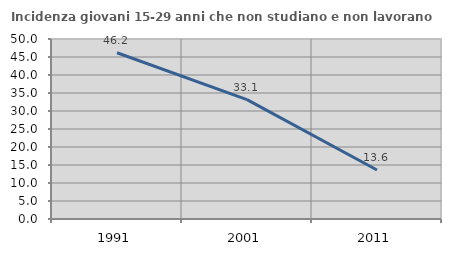
| Category | Incidenza giovani 15-29 anni che non studiano e non lavorano  |
|---|---|
| 1991.0 | 46.176 |
| 2001.0 | 33.143 |
| 2011.0 | 13.6 |